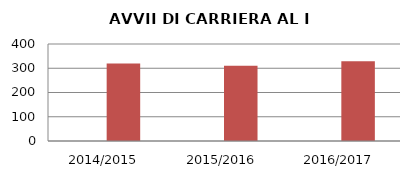
| Category | ANNO | NUMERO |
|---|---|---|
| 2014/2015 | 0 | 320 |
| 2015/2016 | 0 | 310 |
| 2016/2017 | 0 | 329 |